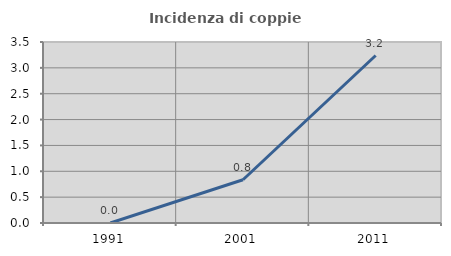
| Category | Incidenza di coppie miste |
|---|---|
| 1991.0 | 0 |
| 2001.0 | 0.837 |
| 2011.0 | 3.239 |